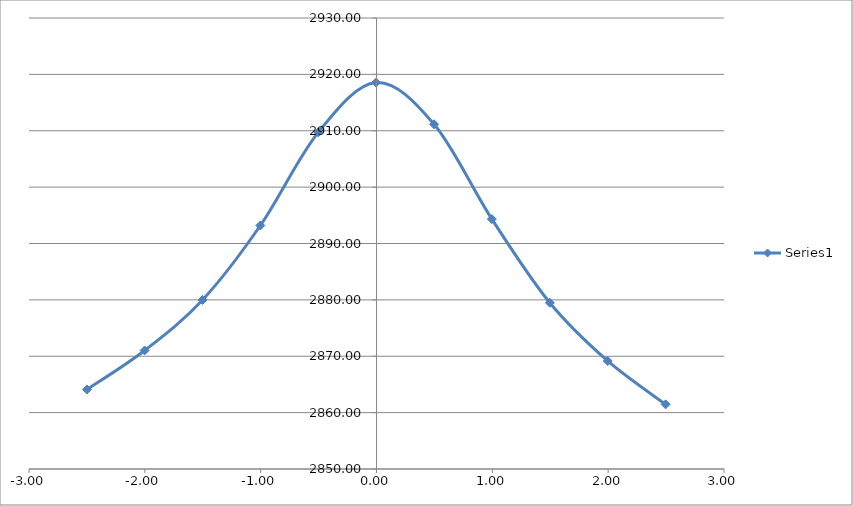
| Category | Series 0 |
|---|---|
| -2.5 | 2864.1 |
| -2.002 | 2871.022 |
| -1.5019999999999998 | 2879.986 |
| -1.0030000000000001 | 2893.191 |
| -0.5030000000000001 | 2909.721 |
| -0.0030000000000001137 | 2918.558 |
| 0.4969999999999999 | 2911.146 |
| 0.9959999999999996 | 2894.326 |
| 1.4959999999999996 | 2879.488 |
| 1.9959999999999996 | 2869.16 |
| 2.4959999999999996 | 2861.466 |